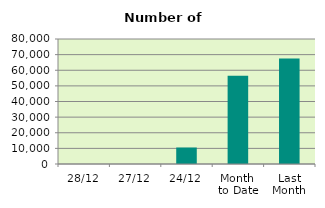
| Category | Series 0 |
|---|---|
| 28/12 | 0 |
| 27/12 | 0 |
| 24/12 | 10560 |
| Month 
to Date | 56538.667 |
| Last
Month | 67470.455 |